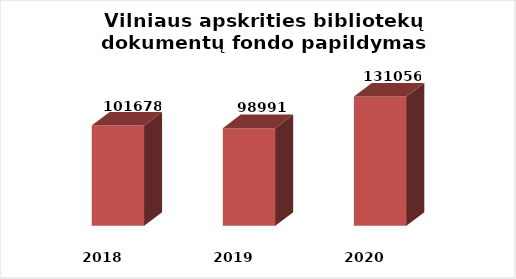
| Category | Series 0 |
|---|---|
| 2018.0 | 101678 |
| 2019.0 | 98991 |
| 2020.0 | 131056 |